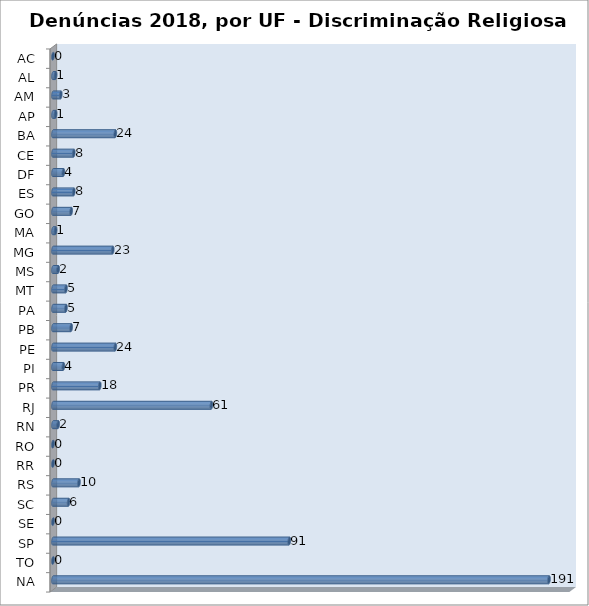
| Category | Series 0 |
|---|---|
| AC | 0 |
| AL | 1 |
| AM | 3 |
| AP | 1 |
| BA | 24 |
| CE | 8 |
| DF | 4 |
| ES | 8 |
| GO | 7 |
| MA | 1 |
| MG | 23 |
| MS | 2 |
| MT | 5 |
| PA | 5 |
| PB | 7 |
| PE | 24 |
| PI | 4 |
| PR | 18 |
| RJ | 61 |
| RN | 2 |
| RO | 0 |
| RR | 0 |
| RS | 10 |
| SC | 6 |
| SE | 0 |
| SP | 91 |
| TO | 0 |
| NA | 191 |